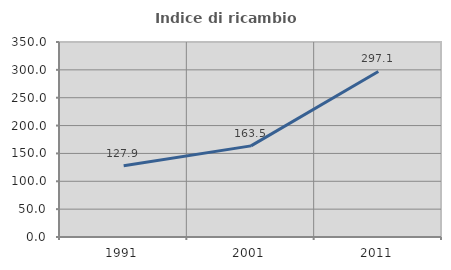
| Category | Indice di ricambio occupazionale  |
|---|---|
| 1991.0 | 127.876 |
| 2001.0 | 163.536 |
| 2011.0 | 297.059 |